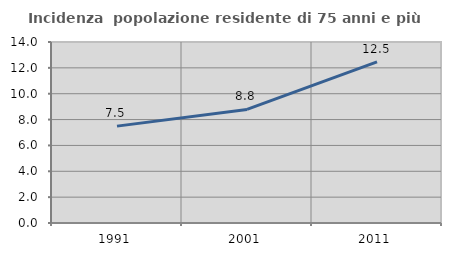
| Category | Incidenza  popolazione residente di 75 anni e più |
|---|---|
| 1991.0 | 7.494 |
| 2001.0 | 8.783 |
| 2011.0 | 12.461 |